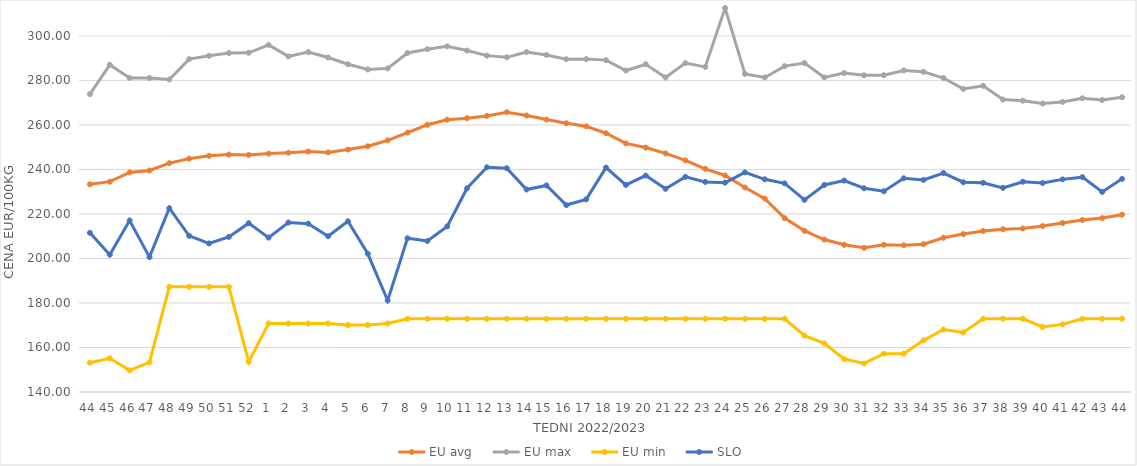
| Category | EU avg | EU max | EU min | SLO |
|---|---|---|---|---|
| 44.0 | 233.325 | 273.856 | 153.16 | 211.53 |
| 45.0 | 234.517 | 287.021 | 155.13 | 201.69 |
| 46.0 | 238.669 | 281.133 | 149.75 | 217.08 |
| 47.0 | 239.534 | 281.102 | 153.36 | 200.62 |
| 48.0 | 242.81 | 280.434 | 187.26 | 222.61 |
| 49.0 | 244.854 | 289.585 | 187.26 | 210.16 |
| 50.0 | 246.132 | 291.057 | 187.26 | 206.76 |
| 51.0 | 246.705 | 292.307 | 187.26 | 209.69 |
| 52.0 | 246.546 | 292.426 | 153.54 | 215.87 |
| 1.0 | 247.118 | 295.98 | 170.79 | 209.37 |
| 2.0 | 247.516 | 290.8 | 170.79 | 216.15 |
| 3.0 | 248.079 | 292.71 | 170.79 | 215.63 |
| 4.0 | 247.672 | 290.32 | 170.79 | 210 |
| 5.0 | 248.924 | 287.27 | 170.09 | 216.7 |
| 6.0 | 250.4 | 284.92 | 170.09 | 202.1 |
| 7.0 | 253.074 | 285.42 | 170.79 | 181.11 |
| 8.0 | 256.543 | 292.35 | 172.91 | 209.08 |
| 9.0 | 260.066 | 294.02 | 172.91 | 207.87 |
| 10.0 | 262.352 | 295.33 | 172.91 | 214.42 |
| 11.0 | 263.049 | 293.44 | 172.91 | 231.56 |
| 12.0 | 264.068 | 291.15 | 172.91 | 240.97 |
| 13.0 | 265.73 | 290.38 | 172.91 | 240.55 |
| 14.0 | 264.262 | 292.763 | 172.91 | 230.99 |
| 15.0 | 262.411 | 291.46 | 172.91 | 232.82 |
| 16.0 | 260.77 | 289.56 | 172.91 | 224 |
| 17.0 | 259.395 | 289.61 | 172.91 | 226.57 |
| 18.0 | 256.275 | 289.13 | 172.91 | 240.83 |
| 19.0 | 251.716 | 284.45 | 172.91 | 233.05 |
| 20.0 | 249.836 | 287.26 | 172.91 | 237.25 |
| 21.0 | 247.212 | 281.33 | 172.91 | 231.3 |
| 22.0 | 244.103 | 287.77 | 172.91 | 236.67 |
| 23.0 | 240.279 | 286.1 | 172.91 | 234.39 |
| 24.0 | 237.289 | 312.54 | 172.91 | 234.08 |
| 25.0 | 231.895 | 282.95 | 172.91 | 238.69 |
| 26.0 | 226.903 | 281.34 | 172.91 | 235.57 |
| 27.0 | 218.126 | 286.43 | 172.91 | 233.75 |
| 28.0 | 212.406 | 287.8 | 165.32 | 226.35 |
| 29.0 | 208.504 | 281.37 | 161.87 | 233.03 |
| 30.0 | 206.149 | 283.3 | 154.8 | 235 |
| 31.0 | 204.79 | 282.32 | 152.83 | 231.55 |
| 32.0 | 206.16 | 282.36 | 157.23 | 230.2 |
| 33.0 | 205.917 | 284.5 | 157.23 | 236.04 |
| 34.0 | 206.436 | 283.9 | 163.21 | 235.32 |
| 35.0 | 209.326 | 281.09 | 168.085 | 238.39 |
| 36.0 | 210.957 | 276.21 | 166.745 | 234.27 |
| 37.0 | 212.325 | 277.59 | 172.91 | 234 |
| 38.0 | 213.168 | 271.4 | 172.91 | 231.74 |
| 39.0 | 213.456 | 270.91 | 172.91 | 234.5 |
| 40.0 | 214.595 | 269.62 | 169.209 | 233.92 |
| 41.0 | 215.937 | 270.36 | 170.387 | 235.54 |
| 42.0 | 217.284 | 271.99 | 172.91 | 236.54 |
| 43.0 | 218.144 | 271.22 | 172.91 | 229.92 |
| 44.0 | 219.675 | 272.45 | 172.91 | 235.77 |